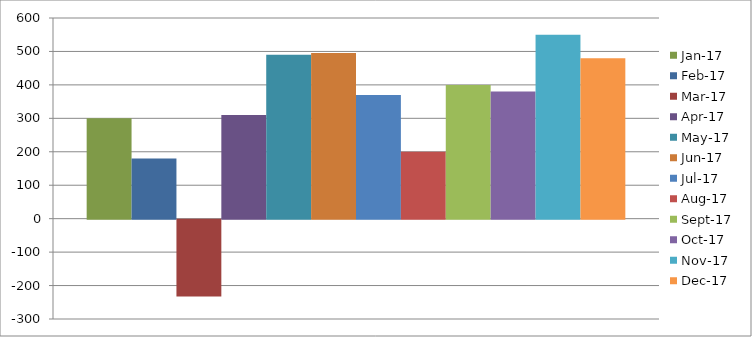
| Category | янв.17 | фев.17 | мар.17 | апр.17 | май.17 | июн.17 | июл.17 | авг.17 | сен.17 | окт.17 | ноя.17 | дек.17 |
|---|---|---|---|---|---|---|---|---|---|---|---|---|
| Собственные оборотные средства | 300 | 180 | -230 | 310 | 490 | 495 | 370 | 200 | 400 | 380 | 550 | 480 |